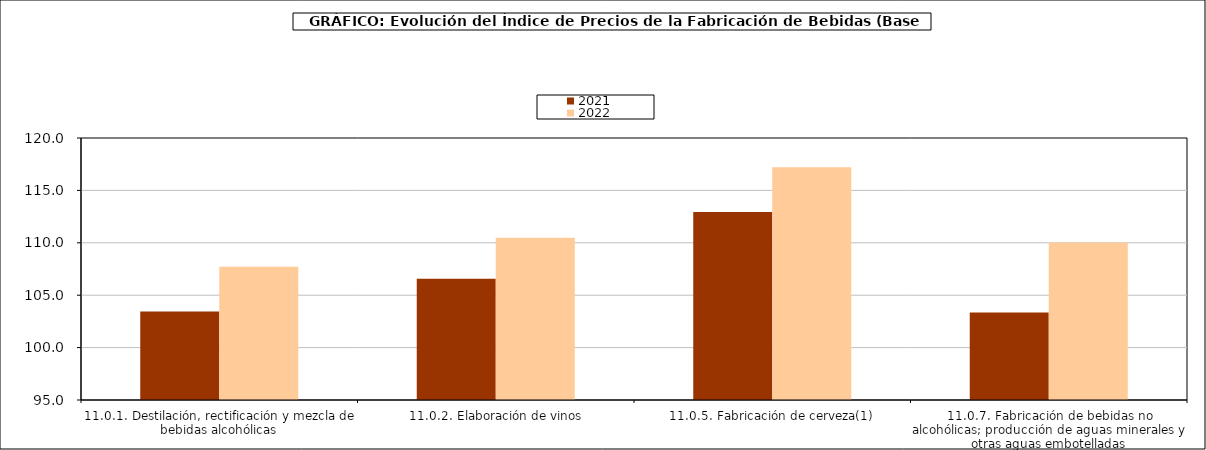
| Category | 2021 | 2022 |
|---|---|---|
| 11.0.1. Destilación, rectificación y mezcla de bebidas alcohólicas | 103.435 | 107.723 |
| 11.0.2. Elaboración de vinos | 106.573 | 110.481 |
| 11.0.5. Fabricación de cerveza(1) | 112.932 | 117.219 |
| 11.0.7. Fabricación de bebidas no alcohólicas; producción de aguas minerales y otras aguas embotelladas | 103.349 | 110.034 |